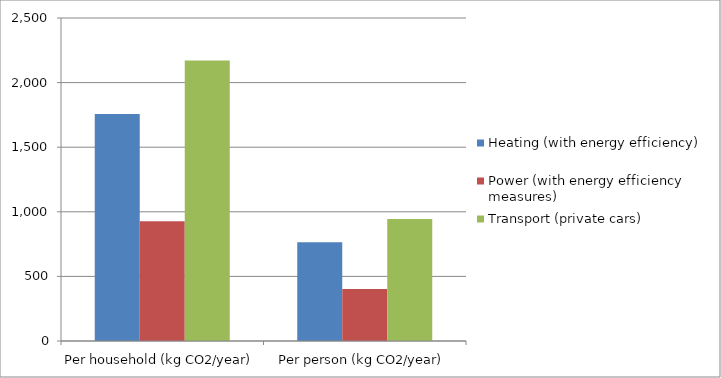
| Category | Heating (with energy efficiency) | Power (with energy efficiency measures) | Transport (private cars) |
|---|---|---|---|
| Per household (kg CO2/year) | 1757.72 | 927.165 | 2170.607 |
| Per person (kg CO2/year) | 764.226 | 403.115 | 943.742 |